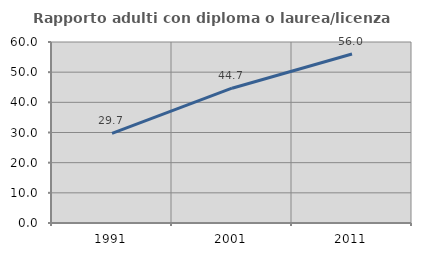
| Category | Rapporto adulti con diploma o laurea/licenza media  |
|---|---|
| 1991.0 | 29.694 |
| 2001.0 | 44.681 |
| 2011.0 | 56.044 |